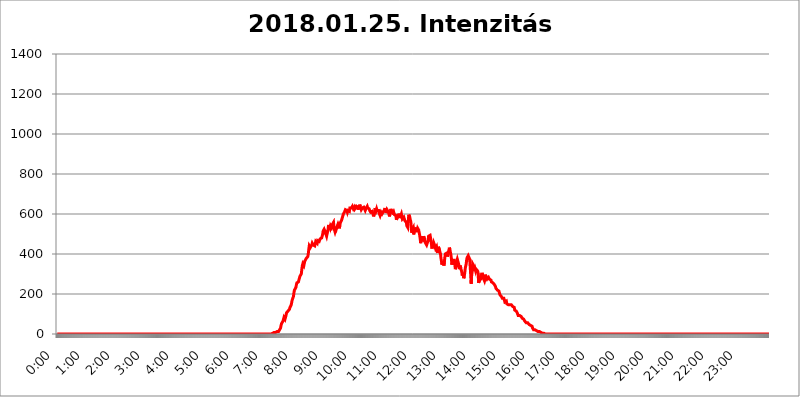
| Category | 2018.01.25. Intenzitás [W/m^2] |
|---|---|
| 0.0 | 0 |
| 0.0006944444444444445 | 0 |
| 0.001388888888888889 | 0 |
| 0.0020833333333333333 | 0 |
| 0.002777777777777778 | 0 |
| 0.003472222222222222 | 0 |
| 0.004166666666666667 | 0 |
| 0.004861111111111111 | 0 |
| 0.005555555555555556 | 0 |
| 0.0062499999999999995 | 0 |
| 0.006944444444444444 | 0 |
| 0.007638888888888889 | 0 |
| 0.008333333333333333 | 0 |
| 0.009027777777777779 | 0 |
| 0.009722222222222222 | 0 |
| 0.010416666666666666 | 0 |
| 0.011111111111111112 | 0 |
| 0.011805555555555555 | 0 |
| 0.012499999999999999 | 0 |
| 0.013194444444444444 | 0 |
| 0.013888888888888888 | 0 |
| 0.014583333333333332 | 0 |
| 0.015277777777777777 | 0 |
| 0.015972222222222224 | 0 |
| 0.016666666666666666 | 0 |
| 0.017361111111111112 | 0 |
| 0.018055555555555557 | 0 |
| 0.01875 | 0 |
| 0.019444444444444445 | 0 |
| 0.02013888888888889 | 0 |
| 0.020833333333333332 | 0 |
| 0.02152777777777778 | 0 |
| 0.022222222222222223 | 0 |
| 0.02291666666666667 | 0 |
| 0.02361111111111111 | 0 |
| 0.024305555555555556 | 0 |
| 0.024999999999999998 | 0 |
| 0.025694444444444447 | 0 |
| 0.02638888888888889 | 0 |
| 0.027083333333333334 | 0 |
| 0.027777777777777776 | 0 |
| 0.02847222222222222 | 0 |
| 0.029166666666666664 | 0 |
| 0.029861111111111113 | 0 |
| 0.030555555555555555 | 0 |
| 0.03125 | 0 |
| 0.03194444444444445 | 0 |
| 0.03263888888888889 | 0 |
| 0.03333333333333333 | 0 |
| 0.034027777777777775 | 0 |
| 0.034722222222222224 | 0 |
| 0.035416666666666666 | 0 |
| 0.036111111111111115 | 0 |
| 0.03680555555555556 | 0 |
| 0.0375 | 0 |
| 0.03819444444444444 | 0 |
| 0.03888888888888889 | 0 |
| 0.03958333333333333 | 0 |
| 0.04027777777777778 | 0 |
| 0.04097222222222222 | 0 |
| 0.041666666666666664 | 0 |
| 0.042361111111111106 | 0 |
| 0.04305555555555556 | 0 |
| 0.043750000000000004 | 0 |
| 0.044444444444444446 | 0 |
| 0.04513888888888889 | 0 |
| 0.04583333333333334 | 0 |
| 0.04652777777777778 | 0 |
| 0.04722222222222222 | 0 |
| 0.04791666666666666 | 0 |
| 0.04861111111111111 | 0 |
| 0.049305555555555554 | 0 |
| 0.049999999999999996 | 0 |
| 0.05069444444444445 | 0 |
| 0.051388888888888894 | 0 |
| 0.052083333333333336 | 0 |
| 0.05277777777777778 | 0 |
| 0.05347222222222222 | 0 |
| 0.05416666666666667 | 0 |
| 0.05486111111111111 | 0 |
| 0.05555555555555555 | 0 |
| 0.05625 | 0 |
| 0.05694444444444444 | 0 |
| 0.057638888888888885 | 0 |
| 0.05833333333333333 | 0 |
| 0.05902777777777778 | 0 |
| 0.059722222222222225 | 0 |
| 0.06041666666666667 | 0 |
| 0.061111111111111116 | 0 |
| 0.06180555555555556 | 0 |
| 0.0625 | 0 |
| 0.06319444444444444 | 0 |
| 0.06388888888888888 | 0 |
| 0.06458333333333334 | 0 |
| 0.06527777777777778 | 0 |
| 0.06597222222222222 | 0 |
| 0.06666666666666667 | 0 |
| 0.06736111111111111 | 0 |
| 0.06805555555555555 | 0 |
| 0.06874999999999999 | 0 |
| 0.06944444444444443 | 0 |
| 0.07013888888888889 | 0 |
| 0.07083333333333333 | 0 |
| 0.07152777777777779 | 0 |
| 0.07222222222222223 | 0 |
| 0.07291666666666667 | 0 |
| 0.07361111111111111 | 0 |
| 0.07430555555555556 | 0 |
| 0.075 | 0 |
| 0.07569444444444444 | 0 |
| 0.0763888888888889 | 0 |
| 0.07708333333333334 | 0 |
| 0.07777777777777778 | 0 |
| 0.07847222222222222 | 0 |
| 0.07916666666666666 | 0 |
| 0.0798611111111111 | 0 |
| 0.08055555555555556 | 0 |
| 0.08125 | 0 |
| 0.08194444444444444 | 0 |
| 0.08263888888888889 | 0 |
| 0.08333333333333333 | 0 |
| 0.08402777777777777 | 0 |
| 0.08472222222222221 | 0 |
| 0.08541666666666665 | 0 |
| 0.08611111111111112 | 0 |
| 0.08680555555555557 | 0 |
| 0.08750000000000001 | 0 |
| 0.08819444444444445 | 0 |
| 0.08888888888888889 | 0 |
| 0.08958333333333333 | 0 |
| 0.09027777777777778 | 0 |
| 0.09097222222222222 | 0 |
| 0.09166666666666667 | 0 |
| 0.09236111111111112 | 0 |
| 0.09305555555555556 | 0 |
| 0.09375 | 0 |
| 0.09444444444444444 | 0 |
| 0.09513888888888888 | 0 |
| 0.09583333333333333 | 0 |
| 0.09652777777777777 | 0 |
| 0.09722222222222222 | 0 |
| 0.09791666666666667 | 0 |
| 0.09861111111111111 | 0 |
| 0.09930555555555555 | 0 |
| 0.09999999999999999 | 0 |
| 0.10069444444444443 | 0 |
| 0.1013888888888889 | 0 |
| 0.10208333333333335 | 0 |
| 0.10277777777777779 | 0 |
| 0.10347222222222223 | 0 |
| 0.10416666666666667 | 0 |
| 0.10486111111111111 | 0 |
| 0.10555555555555556 | 0 |
| 0.10625 | 0 |
| 0.10694444444444444 | 0 |
| 0.1076388888888889 | 0 |
| 0.10833333333333334 | 0 |
| 0.10902777777777778 | 0 |
| 0.10972222222222222 | 0 |
| 0.1111111111111111 | 0 |
| 0.11180555555555556 | 0 |
| 0.11180555555555556 | 0 |
| 0.1125 | 0 |
| 0.11319444444444444 | 0 |
| 0.11388888888888889 | 0 |
| 0.11458333333333333 | 0 |
| 0.11527777777777777 | 0 |
| 0.11597222222222221 | 0 |
| 0.11666666666666665 | 0 |
| 0.1173611111111111 | 0 |
| 0.11805555555555557 | 0 |
| 0.11944444444444445 | 0 |
| 0.12013888888888889 | 0 |
| 0.12083333333333333 | 0 |
| 0.12152777777777778 | 0 |
| 0.12222222222222223 | 0 |
| 0.12291666666666667 | 0 |
| 0.12291666666666667 | 0 |
| 0.12361111111111112 | 0 |
| 0.12430555555555556 | 0 |
| 0.125 | 0 |
| 0.12569444444444444 | 0 |
| 0.12638888888888888 | 0 |
| 0.12708333333333333 | 0 |
| 0.16875 | 0 |
| 0.12847222222222224 | 0 |
| 0.12916666666666668 | 0 |
| 0.12986111111111112 | 0 |
| 0.13055555555555556 | 0 |
| 0.13125 | 0 |
| 0.13194444444444445 | 0 |
| 0.1326388888888889 | 0 |
| 0.13333333333333333 | 0 |
| 0.13402777777777777 | 0 |
| 0.13402777777777777 | 0 |
| 0.13472222222222222 | 0 |
| 0.13541666666666666 | 0 |
| 0.1361111111111111 | 0 |
| 0.13749999999999998 | 0 |
| 0.13819444444444443 | 0 |
| 0.1388888888888889 | 0 |
| 0.13958333333333334 | 0 |
| 0.14027777777777778 | 0 |
| 0.14097222222222222 | 0 |
| 0.14166666666666666 | 0 |
| 0.1423611111111111 | 0 |
| 0.14305555555555557 | 0 |
| 0.14375000000000002 | 0 |
| 0.14444444444444446 | 0 |
| 0.1451388888888889 | 0 |
| 0.1451388888888889 | 0 |
| 0.14652777777777778 | 0 |
| 0.14722222222222223 | 0 |
| 0.14791666666666667 | 0 |
| 0.1486111111111111 | 0 |
| 0.14930555555555555 | 0 |
| 0.15 | 0 |
| 0.15069444444444444 | 0 |
| 0.15138888888888888 | 0 |
| 0.15208333333333332 | 0 |
| 0.15277777777777776 | 0 |
| 0.15347222222222223 | 0 |
| 0.15416666666666667 | 0 |
| 0.15486111111111112 | 0 |
| 0.15555555555555556 | 0 |
| 0.15625 | 0 |
| 0.15694444444444444 | 0 |
| 0.15763888888888888 | 0 |
| 0.15833333333333333 | 0 |
| 0.15902777777777777 | 0 |
| 0.15972222222222224 | 0 |
| 0.16041666666666668 | 0 |
| 0.16111111111111112 | 0 |
| 0.16180555555555556 | 0 |
| 0.1625 | 0 |
| 0.16319444444444445 | 0 |
| 0.1638888888888889 | 0 |
| 0.16458333333333333 | 0 |
| 0.16527777777777777 | 0 |
| 0.16597222222222222 | 0 |
| 0.16666666666666666 | 0 |
| 0.1673611111111111 | 0 |
| 0.16805555555555554 | 0 |
| 0.16874999999999998 | 0 |
| 0.16944444444444443 | 0 |
| 0.17013888888888887 | 0 |
| 0.1708333333333333 | 0 |
| 0.17152777777777775 | 0 |
| 0.17222222222222225 | 0 |
| 0.1729166666666667 | 0 |
| 0.17361111111111113 | 0 |
| 0.17430555555555557 | 0 |
| 0.17500000000000002 | 0 |
| 0.17569444444444446 | 0 |
| 0.1763888888888889 | 0 |
| 0.17708333333333334 | 0 |
| 0.17777777777777778 | 0 |
| 0.17847222222222223 | 0 |
| 0.17916666666666667 | 0 |
| 0.1798611111111111 | 0 |
| 0.18055555555555555 | 0 |
| 0.18125 | 0 |
| 0.18194444444444444 | 0 |
| 0.1826388888888889 | 0 |
| 0.18333333333333335 | 0 |
| 0.1840277777777778 | 0 |
| 0.18472222222222223 | 0 |
| 0.18541666666666667 | 0 |
| 0.18611111111111112 | 0 |
| 0.18680555555555556 | 0 |
| 0.1875 | 0 |
| 0.18819444444444444 | 0 |
| 0.18888888888888888 | 0 |
| 0.18958333333333333 | 0 |
| 0.19027777777777777 | 0 |
| 0.1909722222222222 | 0 |
| 0.19166666666666665 | 0 |
| 0.19236111111111112 | 0 |
| 0.19305555555555554 | 0 |
| 0.19375 | 0 |
| 0.19444444444444445 | 0 |
| 0.1951388888888889 | 0 |
| 0.19583333333333333 | 0 |
| 0.19652777777777777 | 0 |
| 0.19722222222222222 | 0 |
| 0.19791666666666666 | 0 |
| 0.1986111111111111 | 0 |
| 0.19930555555555554 | 0 |
| 0.19999999999999998 | 0 |
| 0.20069444444444443 | 0 |
| 0.20138888888888887 | 0 |
| 0.2020833333333333 | 0 |
| 0.2027777777777778 | 0 |
| 0.2034722222222222 | 0 |
| 0.2041666666666667 | 0 |
| 0.20486111111111113 | 0 |
| 0.20555555555555557 | 0 |
| 0.20625000000000002 | 0 |
| 0.20694444444444446 | 0 |
| 0.2076388888888889 | 0 |
| 0.20833333333333334 | 0 |
| 0.20902777777777778 | 0 |
| 0.20972222222222223 | 0 |
| 0.21041666666666667 | 0 |
| 0.2111111111111111 | 0 |
| 0.21180555555555555 | 0 |
| 0.2125 | 0 |
| 0.21319444444444444 | 0 |
| 0.2138888888888889 | 0 |
| 0.21458333333333335 | 0 |
| 0.2152777777777778 | 0 |
| 0.21597222222222223 | 0 |
| 0.21666666666666667 | 0 |
| 0.21736111111111112 | 0 |
| 0.21805555555555556 | 0 |
| 0.21875 | 0 |
| 0.21944444444444444 | 0 |
| 0.22013888888888888 | 0 |
| 0.22083333333333333 | 0 |
| 0.22152777777777777 | 0 |
| 0.2222222222222222 | 0 |
| 0.22291666666666665 | 0 |
| 0.2236111111111111 | 0 |
| 0.22430555555555556 | 0 |
| 0.225 | 0 |
| 0.22569444444444445 | 0 |
| 0.2263888888888889 | 0 |
| 0.22708333333333333 | 0 |
| 0.22777777777777777 | 0 |
| 0.22847222222222222 | 0 |
| 0.22916666666666666 | 0 |
| 0.2298611111111111 | 0 |
| 0.23055555555555554 | 0 |
| 0.23124999999999998 | 0 |
| 0.23194444444444443 | 0 |
| 0.23263888888888887 | 0 |
| 0.2333333333333333 | 0 |
| 0.2340277777777778 | 0 |
| 0.2347222222222222 | 0 |
| 0.2354166666666667 | 0 |
| 0.23611111111111113 | 0 |
| 0.23680555555555557 | 0 |
| 0.23750000000000002 | 0 |
| 0.23819444444444446 | 0 |
| 0.2388888888888889 | 0 |
| 0.23958333333333334 | 0 |
| 0.24027777777777778 | 0 |
| 0.24097222222222223 | 0 |
| 0.24166666666666667 | 0 |
| 0.2423611111111111 | 0 |
| 0.24305555555555555 | 0 |
| 0.24375 | 0 |
| 0.24444444444444446 | 0 |
| 0.24513888888888888 | 0 |
| 0.24583333333333335 | 0 |
| 0.2465277777777778 | 0 |
| 0.24722222222222223 | 0 |
| 0.24791666666666667 | 0 |
| 0.24861111111111112 | 0 |
| 0.24930555555555556 | 0 |
| 0.25 | 0 |
| 0.25069444444444444 | 0 |
| 0.2513888888888889 | 0 |
| 0.2520833333333333 | 0 |
| 0.25277777777777777 | 0 |
| 0.2534722222222222 | 0 |
| 0.25416666666666665 | 0 |
| 0.2548611111111111 | 0 |
| 0.2555555555555556 | 0 |
| 0.25625000000000003 | 0 |
| 0.2569444444444445 | 0 |
| 0.2576388888888889 | 0 |
| 0.25833333333333336 | 0 |
| 0.2590277777777778 | 0 |
| 0.25972222222222224 | 0 |
| 0.2604166666666667 | 0 |
| 0.2611111111111111 | 0 |
| 0.26180555555555557 | 0 |
| 0.2625 | 0 |
| 0.26319444444444445 | 0 |
| 0.2638888888888889 | 0 |
| 0.26458333333333334 | 0 |
| 0.2652777777777778 | 0 |
| 0.2659722222222222 | 0 |
| 0.26666666666666666 | 0 |
| 0.2673611111111111 | 0 |
| 0.26805555555555555 | 0 |
| 0.26875 | 0 |
| 0.26944444444444443 | 0 |
| 0.2701388888888889 | 0 |
| 0.2708333333333333 | 0 |
| 0.27152777777777776 | 0 |
| 0.2722222222222222 | 0 |
| 0.27291666666666664 | 0 |
| 0.2736111111111111 | 0 |
| 0.2743055555555555 | 0 |
| 0.27499999999999997 | 0 |
| 0.27569444444444446 | 0 |
| 0.27638888888888885 | 0 |
| 0.27708333333333335 | 0 |
| 0.2777777777777778 | 0 |
| 0.27847222222222223 | 0 |
| 0.2791666666666667 | 0 |
| 0.2798611111111111 | 0 |
| 0.28055555555555556 | 0 |
| 0.28125 | 0 |
| 0.28194444444444444 | 0 |
| 0.2826388888888889 | 0 |
| 0.2833333333333333 | 0 |
| 0.28402777777777777 | 0 |
| 0.2847222222222222 | 0 |
| 0.28541666666666665 | 0 |
| 0.28611111111111115 | 0 |
| 0.28680555555555554 | 0 |
| 0.28750000000000003 | 0 |
| 0.2881944444444445 | 0 |
| 0.2888888888888889 | 0 |
| 0.28958333333333336 | 0 |
| 0.2902777777777778 | 0 |
| 0.29097222222222224 | 0 |
| 0.2916666666666667 | 0 |
| 0.2923611111111111 | 0 |
| 0.29305555555555557 | 0 |
| 0.29375 | 0 |
| 0.29444444444444445 | 0 |
| 0.2951388888888889 | 0 |
| 0.29583333333333334 | 0 |
| 0.2965277777777778 | 0 |
| 0.2972222222222222 | 0 |
| 0.29791666666666666 | 0 |
| 0.2986111111111111 | 0 |
| 0.29930555555555555 | 3.525 |
| 0.3 | 0 |
| 0.30069444444444443 | 3.525 |
| 0.3013888888888889 | 3.525 |
| 0.3020833333333333 | 3.525 |
| 0.30277777777777776 | 3.525 |
| 0.3034722222222222 | 3.525 |
| 0.30416666666666664 | 7.887 |
| 0.3048611111111111 | 7.887 |
| 0.3055555555555555 | 7.887 |
| 0.30624999999999997 | 7.887 |
| 0.3069444444444444 | 7.887 |
| 0.3076388888888889 | 7.887 |
| 0.30833333333333335 | 12.257 |
| 0.3090277777777778 | 12.257 |
| 0.30972222222222223 | 12.257 |
| 0.3104166666666667 | 12.257 |
| 0.3111111111111111 | 16.636 |
| 0.31180555555555556 | 21.024 |
| 0.3125 | 25.419 |
| 0.31319444444444444 | 29.823 |
| 0.3138888888888889 | 43.079 |
| 0.3145833333333333 | 51.951 |
| 0.31527777777777777 | 56.398 |
| 0.3159722222222222 | 56.398 |
| 0.31666666666666665 | 65.31 |
| 0.31736111111111115 | 74.246 |
| 0.31805555555555554 | 83.205 |
| 0.31875000000000003 | 83.205 |
| 0.3194444444444445 | 74.246 |
| 0.3201388888888889 | 74.246 |
| 0.32083333333333336 | 92.184 |
| 0.3215277777777778 | 105.69 |
| 0.32222222222222224 | 105.69 |
| 0.3229166666666667 | 105.69 |
| 0.3236111111111111 | 114.716 |
| 0.32430555555555557 | 119.235 |
| 0.325 | 119.235 |
| 0.32569444444444445 | 123.758 |
| 0.3263888888888889 | 132.814 |
| 0.32708333333333334 | 137.347 |
| 0.3277777777777778 | 141.884 |
| 0.3284722222222222 | 150.964 |
| 0.32916666666666666 | 164.605 |
| 0.3298611111111111 | 173.709 |
| 0.33055555555555555 | 178.264 |
| 0.33125 | 187.378 |
| 0.33194444444444443 | 205.62 |
| 0.3326388888888889 | 219.309 |
| 0.3333333333333333 | 219.309 |
| 0.3340277777777778 | 219.309 |
| 0.3347222222222222 | 233 |
| 0.3354166666666667 | 246.689 |
| 0.3361111111111111 | 255.813 |
| 0.3368055555555556 | 255.813 |
| 0.33749999999999997 | 251.251 |
| 0.33819444444444446 | 260.373 |
| 0.33888888888888885 | 269.49 |
| 0.33958333333333335 | 278.603 |
| 0.34027777777777773 | 287.709 |
| 0.34097222222222223 | 283.156 |
| 0.3416666666666666 | 287.709 |
| 0.3423611111111111 | 301.354 |
| 0.3430555555555555 | 324.052 |
| 0.34375 | 342.162 |
| 0.3444444444444445 | 351.198 |
| 0.3451388888888889 | 351.198 |
| 0.3458333333333334 | 342.162 |
| 0.34652777777777777 | 346.682 |
| 0.34722222222222227 | 364.728 |
| 0.34791666666666665 | 364.728 |
| 0.34861111111111115 | 364.728 |
| 0.34930555555555554 | 378.224 |
| 0.35000000000000003 | 378.224 |
| 0.3506944444444444 | 378.224 |
| 0.3513888888888889 | 387.202 |
| 0.3520833333333333 | 400.638 |
| 0.3527777777777778 | 422.943 |
| 0.3534722222222222 | 440.702 |
| 0.3541666666666667 | 436.27 |
| 0.3548611111111111 | 431.833 |
| 0.35555555555555557 | 431.833 |
| 0.35625 | 427.39 |
| 0.35694444444444445 | 445.129 |
| 0.3576388888888889 | 453.968 |
| 0.35833333333333334 | 453.968 |
| 0.3590277777777778 | 445.129 |
| 0.3597222222222222 | 449.551 |
| 0.36041666666666666 | 449.551 |
| 0.3611111111111111 | 440.702 |
| 0.36180555555555555 | 440.702 |
| 0.3625 | 462.786 |
| 0.36319444444444443 | 462.786 |
| 0.3638888888888889 | 458.38 |
| 0.3645833333333333 | 453.968 |
| 0.3652777777777778 | 467.187 |
| 0.3659722222222222 | 471.582 |
| 0.3666666666666667 | 467.187 |
| 0.3673611111111111 | 462.786 |
| 0.3680555555555556 | 462.786 |
| 0.36874999999999997 | 475.972 |
| 0.36944444444444446 | 475.972 |
| 0.37013888888888885 | 471.582 |
| 0.37083333333333335 | 480.356 |
| 0.37152777777777773 | 484.735 |
| 0.37222222222222223 | 497.836 |
| 0.3729166666666666 | 515.223 |
| 0.3736111111111111 | 519.555 |
| 0.3743055555555555 | 523.88 |
| 0.375 | 519.555 |
| 0.3756944444444445 | 510.885 |
| 0.3763888888888889 | 506.542 |
| 0.3770833333333334 | 510.885 |
| 0.37777777777777777 | 489.108 |
| 0.37847222222222227 | 493.475 |
| 0.37916666666666665 | 489.108 |
| 0.37986111111111115 | 523.88 |
| 0.38055555555555554 | 545.416 |
| 0.38125000000000003 | 541.121 |
| 0.3819444444444444 | 541.121 |
| 0.3826388888888889 | 528.2 |
| 0.3833333333333333 | 541.121 |
| 0.3840277777777778 | 536.82 |
| 0.3847222222222222 | 532.513 |
| 0.3854166666666667 | 528.2 |
| 0.3861111111111111 | 549.704 |
| 0.38680555555555557 | 549.704 |
| 0.3875 | 558.261 |
| 0.38819444444444445 | 532.513 |
| 0.3888888888888889 | 519.555 |
| 0.38958333333333334 | 510.885 |
| 0.3902777777777778 | 519.555 |
| 0.3909722222222222 | 536.82 |
| 0.39166666666666666 | 528.2 |
| 0.3923611111111111 | 536.82 |
| 0.39305555555555555 | 541.121 |
| 0.39375 | 549.704 |
| 0.39444444444444443 | 545.416 |
| 0.3951388888888889 | 536.82 |
| 0.3958333333333333 | 528.2 |
| 0.3965277777777778 | 553.986 |
| 0.3972222222222222 | 553.986 |
| 0.3979166666666667 | 549.704 |
| 0.3986111111111111 | 566.793 |
| 0.3993055555555556 | 571.049 |
| 0.39999999999999997 | 583.779 |
| 0.40069444444444446 | 592.233 |
| 0.40138888888888885 | 600.661 |
| 0.40208333333333335 | 604.864 |
| 0.40277777777777773 | 609.062 |
| 0.40347222222222223 | 604.864 |
| 0.4041666666666666 | 621.613 |
| 0.4048611111111111 | 625.784 |
| 0.4055555555555555 | 621.613 |
| 0.40625 | 617.436 |
| 0.4069444444444445 | 609.062 |
| 0.4076388888888889 | 617.436 |
| 0.4083333333333334 | 621.613 |
| 0.40902777777777777 | 613.252 |
| 0.40972222222222227 | 613.252 |
| 0.41041666666666665 | 629.948 |
| 0.41111111111111115 | 629.948 |
| 0.41180555555555554 | 625.784 |
| 0.41250000000000003 | 629.948 |
| 0.4131944444444444 | 629.948 |
| 0.4138888888888889 | 638.256 |
| 0.4145833333333333 | 638.256 |
| 0.4152777777777778 | 625.784 |
| 0.4159722222222222 | 629.948 |
| 0.4166666666666667 | 634.105 |
| 0.4173611111111111 | 625.784 |
| 0.41805555555555557 | 625.784 |
| 0.41875 | 629.948 |
| 0.41944444444444445 | 638.256 |
| 0.4201388888888889 | 638.256 |
| 0.42083333333333334 | 634.105 |
| 0.4215277777777778 | 629.948 |
| 0.4222222222222222 | 621.613 |
| 0.42291666666666666 | 642.4 |
| 0.4236111111111111 | 634.105 |
| 0.42430555555555555 | 646.537 |
| 0.425 | 638.256 |
| 0.42569444444444443 | 634.105 |
| 0.4263888888888889 | 621.613 |
| 0.4270833333333333 | 625.784 |
| 0.4277777777777778 | 629.948 |
| 0.4284722222222222 | 634.105 |
| 0.4291666666666667 | 634.105 |
| 0.4298611111111111 | 634.105 |
| 0.4305555555555556 | 638.256 |
| 0.43124999999999997 | 629.948 |
| 0.43194444444444446 | 617.436 |
| 0.43263888888888885 | 621.613 |
| 0.43333333333333335 | 629.948 |
| 0.43402777777777773 | 634.105 |
| 0.43472222222222223 | 638.256 |
| 0.4354166666666666 | 629.948 |
| 0.4361111111111111 | 629.948 |
| 0.4368055555555555 | 625.784 |
| 0.4375 | 625.784 |
| 0.4381944444444445 | 617.436 |
| 0.4388888888888889 | 613.252 |
| 0.4395833333333334 | 609.062 |
| 0.44027777777777777 | 613.252 |
| 0.44097222222222227 | 609.062 |
| 0.44166666666666665 | 613.252 |
| 0.44236111111111115 | 609.062 |
| 0.44305555555555554 | 596.45 |
| 0.44375000000000003 | 588.009 |
| 0.4444444444444444 | 583.779 |
| 0.4451388888888889 | 609.062 |
| 0.4458333333333333 | 629.948 |
| 0.4465277777777778 | 629.948 |
| 0.4472222222222222 | 617.436 |
| 0.4479166666666667 | 625.784 |
| 0.4486111111111111 | 617.436 |
| 0.44930555555555557 | 617.436 |
| 0.45 | 617.436 |
| 0.45069444444444445 | 617.436 |
| 0.4513888888888889 | 604.864 |
| 0.45208333333333334 | 609.062 |
| 0.4527777777777778 | 592.233 |
| 0.4534722222222222 | 592.233 |
| 0.45416666666666666 | 609.062 |
| 0.4548611111111111 | 604.864 |
| 0.45555555555555555 | 600.661 |
| 0.45625 | 596.45 |
| 0.45694444444444443 | 596.45 |
| 0.4576388888888889 | 613.252 |
| 0.4583333333333333 | 609.062 |
| 0.4590277777777778 | 621.613 |
| 0.4597222222222222 | 629.948 |
| 0.4604166666666667 | 617.436 |
| 0.4611111111111111 | 604.864 |
| 0.4618055555555556 | 600.661 |
| 0.46249999999999997 | 621.613 |
| 0.46319444444444446 | 621.613 |
| 0.46388888888888885 | 621.613 |
| 0.46458333333333335 | 609.062 |
| 0.46527777777777773 | 604.864 |
| 0.46597222222222223 | 588.009 |
| 0.4666666666666666 | 600.661 |
| 0.4673611111111111 | 613.252 |
| 0.4680555555555555 | 625.784 |
| 0.46875 | 609.062 |
| 0.4694444444444445 | 609.062 |
| 0.4701388888888889 | 613.252 |
| 0.4708333333333334 | 613.252 |
| 0.47152777777777777 | 596.45 |
| 0.47222222222222227 | 604.864 |
| 0.47291666666666665 | 596.45 |
| 0.47361111111111115 | 600.661 |
| 0.47430555555555554 | 600.661 |
| 0.47500000000000003 | 592.233 |
| 0.4756944444444444 | 571.049 |
| 0.4763888888888889 | 566.793 |
| 0.4770833333333333 | 575.299 |
| 0.4777777777777778 | 592.233 |
| 0.4784722222222222 | 600.661 |
| 0.4791666666666667 | 588.009 |
| 0.4798611111111111 | 600.661 |
| 0.48055555555555557 | 579.542 |
| 0.48125 | 588.009 |
| 0.48194444444444445 | 588.009 |
| 0.4826388888888889 | 600.661 |
| 0.48333333333333334 | 588.009 |
| 0.4840277777777778 | 575.299 |
| 0.4847222222222222 | 579.542 |
| 0.48541666666666666 | 579.542 |
| 0.4861111111111111 | 583.779 |
| 0.48680555555555555 | 583.779 |
| 0.4875 | 566.793 |
| 0.48819444444444443 | 566.793 |
| 0.4888888888888889 | 562.53 |
| 0.4895833333333333 | 558.261 |
| 0.4902777777777778 | 541.121 |
| 0.4909722222222222 | 541.121 |
| 0.4916666666666667 | 532.513 |
| 0.4923611111111111 | 566.793 |
| 0.4930555555555556 | 596.45 |
| 0.49374999999999997 | 592.233 |
| 0.49444444444444446 | 583.779 |
| 0.49513888888888885 | 571.049 |
| 0.49583333333333335 | 562.53 |
| 0.49652777777777773 | 536.82 |
| 0.49722222222222223 | 506.542 |
| 0.4979166666666666 | 523.88 |
| 0.4986111111111111 | 523.88 |
| 0.4993055555555555 | 532.513 |
| 0.5 | 497.836 |
| 0.5006944444444444 | 519.555 |
| 0.5013888888888889 | 532.513 |
| 0.5020833333333333 | 532.513 |
| 0.5027777777777778 | 515.223 |
| 0.5034722222222222 | 519.555 |
| 0.5041666666666667 | 515.223 |
| 0.5048611111111111 | 515.223 |
| 0.5055555555555555 | 528.2 |
| 0.50625 | 532.513 |
| 0.5069444444444444 | 519.555 |
| 0.5076388888888889 | 506.542 |
| 0.5083333333333333 | 493.475 |
| 0.5090277777777777 | 475.972 |
| 0.5097222222222222 | 453.968 |
| 0.5104166666666666 | 480.356 |
| 0.5111111111111112 | 489.108 |
| 0.5118055555555555 | 475.972 |
| 0.5125000000000001 | 462.786 |
| 0.5131944444444444 | 471.582 |
| 0.513888888888889 | 489.108 |
| 0.5145833333333333 | 484.735 |
| 0.5152777777777778 | 471.582 |
| 0.5159722222222222 | 458.38 |
| 0.5166666666666667 | 462.786 |
| 0.517361111111111 | 453.968 |
| 0.5180555555555556 | 445.129 |
| 0.5187499999999999 | 445.129 |
| 0.5194444444444445 | 449.551 |
| 0.5201388888888888 | 467.187 |
| 0.5208333333333334 | 489.108 |
| 0.5215277777777778 | 493.475 |
| 0.5222222222222223 | 493.475 |
| 0.5229166666666667 | 493.475 |
| 0.5236111111111111 | 480.356 |
| 0.5243055555555556 | 475.972 |
| 0.525 | 445.129 |
| 0.5256944444444445 | 427.39 |
| 0.5263888888888889 | 458.38 |
| 0.5270833333333333 | 449.551 |
| 0.5277777777777778 | 458.38 |
| 0.5284722222222222 | 453.968 |
| 0.5291666666666667 | 445.129 |
| 0.5298611111111111 | 436.27 |
| 0.5305555555555556 | 427.39 |
| 0.53125 | 431.833 |
| 0.5319444444444444 | 436.27 |
| 0.5326388888888889 | 418.492 |
| 0.5333333333333333 | 405.108 |
| 0.5340277777777778 | 422.943 |
| 0.5347222222222222 | 436.27 |
| 0.5354166666666667 | 436.27 |
| 0.5361111111111111 | 418.492 |
| 0.5368055555555555 | 414.035 |
| 0.5375 | 400.638 |
| 0.5381944444444444 | 378.224 |
| 0.5388888888888889 | 364.728 |
| 0.5395833333333333 | 346.682 |
| 0.5402777777777777 | 364.728 |
| 0.5409722222222222 | 364.728 |
| 0.5416666666666666 | 351.198 |
| 0.5423611111111112 | 342.162 |
| 0.5430555555555555 | 364.728 |
| 0.5437500000000001 | 387.202 |
| 0.5444444444444444 | 400.638 |
| 0.545138888888889 | 405.108 |
| 0.5458333333333333 | 405.108 |
| 0.5465277777777778 | 405.108 |
| 0.5472222222222222 | 387.202 |
| 0.5479166666666667 | 396.164 |
| 0.548611111111111 | 405.108 |
| 0.5493055555555556 | 409.574 |
| 0.5499999999999999 | 431.833 |
| 0.5506944444444445 | 422.943 |
| 0.5513888888888888 | 409.574 |
| 0.5520833333333334 | 396.164 |
| 0.5527777777777778 | 378.224 |
| 0.5534722222222223 | 346.682 |
| 0.5541666666666667 | 342.162 |
| 0.5548611111111111 | 369.23 |
| 0.5555555555555556 | 369.23 |
| 0.55625 | 369.23 |
| 0.5569444444444445 | 369.23 |
| 0.5576388888888889 | 346.682 |
| 0.5583333333333333 | 324.052 |
| 0.5590277777777778 | 333.113 |
| 0.5597222222222222 | 355.712 |
| 0.5604166666666667 | 360.221 |
| 0.5611111111111111 | 373.729 |
| 0.5618055555555556 | 364.728 |
| 0.5625 | 364.728 |
| 0.5631944444444444 | 346.682 |
| 0.5638888888888889 | 324.052 |
| 0.5645833333333333 | 319.517 |
| 0.5652777777777778 | 342.162 |
| 0.5659722222222222 | 328.584 |
| 0.5666666666666667 | 324.052 |
| 0.5673611111111111 | 310.44 |
| 0.5680555555555555 | 292.259 |
| 0.56875 | 305.898 |
| 0.5694444444444444 | 296.808 |
| 0.5701388888888889 | 278.603 |
| 0.5708333333333333 | 287.709 |
| 0.5715277777777777 | 305.898 |
| 0.5722222222222222 | 328.584 |
| 0.5729166666666666 | 328.584 |
| 0.5736111111111112 | 351.198 |
| 0.5743055555555555 | 373.729 |
| 0.5750000000000001 | 382.715 |
| 0.5756944444444444 | 382.715 |
| 0.576388888888889 | 391.685 |
| 0.5770833333333333 | 396.164 |
| 0.5777777777777778 | 387.202 |
| 0.5784722222222222 | 373.729 |
| 0.5791666666666667 | 373.729 |
| 0.579861111111111 | 296.808 |
| 0.5805555555555556 | 251.251 |
| 0.5812499999999999 | 296.808 |
| 0.5819444444444445 | 310.44 |
| 0.5826388888888888 | 351.198 |
| 0.5833333333333334 | 351.198 |
| 0.5840277777777778 | 346.682 |
| 0.5847222222222223 | 337.639 |
| 0.5854166666666667 | 314.98 |
| 0.5861111111111111 | 324.052 |
| 0.5868055555555556 | 314.98 |
| 0.5875 | 324.052 |
| 0.5881944444444445 | 324.052 |
| 0.5888888888888889 | 319.517 |
| 0.5895833333333333 | 314.98 |
| 0.5902777777777778 | 305.898 |
| 0.5909722222222222 | 255.813 |
| 0.5916666666666667 | 255.813 |
| 0.5923611111111111 | 269.49 |
| 0.5930555555555556 | 278.603 |
| 0.59375 | 269.49 |
| 0.5944444444444444 | 264.932 |
| 0.5951388888888889 | 296.808 |
| 0.5958333333333333 | 305.898 |
| 0.5965277777777778 | 301.354 |
| 0.5972222222222222 | 283.156 |
| 0.5979166666666667 | 287.709 |
| 0.5986111111111111 | 283.156 |
| 0.5993055555555555 | 264.932 |
| 0.6 | 274.047 |
| 0.6006944444444444 | 296.808 |
| 0.6013888888888889 | 283.156 |
| 0.6020833333333333 | 283.156 |
| 0.6027777777777777 | 274.047 |
| 0.6034722222222222 | 278.603 |
| 0.6041666666666666 | 278.603 |
| 0.6048611111111112 | 283.156 |
| 0.6055555555555555 | 278.603 |
| 0.6062500000000001 | 274.047 |
| 0.6069444444444444 | 274.047 |
| 0.607638888888889 | 269.49 |
| 0.6083333333333333 | 269.49 |
| 0.6090277777777778 | 260.373 |
| 0.6097222222222222 | 260.373 |
| 0.6104166666666667 | 260.373 |
| 0.611111111111111 | 255.813 |
| 0.6118055555555556 | 255.813 |
| 0.6124999999999999 | 251.251 |
| 0.6131944444444445 | 246.689 |
| 0.6138888888888888 | 242.127 |
| 0.6145833333333334 | 237.564 |
| 0.6152777777777778 | 228.436 |
| 0.6159722222222223 | 228.436 |
| 0.6166666666666667 | 228.436 |
| 0.6173611111111111 | 219.309 |
| 0.6180555555555556 | 219.309 |
| 0.61875 | 219.309 |
| 0.6194444444444445 | 214.746 |
| 0.6201388888888889 | 210.182 |
| 0.6208333333333333 | 196.497 |
| 0.6215277777777778 | 196.497 |
| 0.6222222222222222 | 191.937 |
| 0.6229166666666667 | 187.378 |
| 0.6236111111111111 | 191.937 |
| 0.6243055555555556 | 178.264 |
| 0.625 | 182.82 |
| 0.6256944444444444 | 182.82 |
| 0.6263888888888889 | 178.264 |
| 0.6270833333333333 | 169.156 |
| 0.6277777777777778 | 160.056 |
| 0.6284722222222222 | 155.509 |
| 0.6291666666666667 | 160.056 |
| 0.6298611111111111 | 164.605 |
| 0.6305555555555555 | 150.964 |
| 0.63125 | 155.509 |
| 0.6319444444444444 | 150.964 |
| 0.6326388888888889 | 146.423 |
| 0.6333333333333333 | 146.423 |
| 0.6340277777777777 | 146.423 |
| 0.6347222222222222 | 146.423 |
| 0.6354166666666666 | 146.423 |
| 0.6361111111111112 | 146.423 |
| 0.6368055555555555 | 146.423 |
| 0.6375000000000001 | 141.884 |
| 0.6381944444444444 | 141.884 |
| 0.638888888888889 | 137.347 |
| 0.6395833333333333 | 132.814 |
| 0.6402777777777778 | 132.814 |
| 0.6409722222222222 | 132.814 |
| 0.6416666666666667 | 119.235 |
| 0.642361111111111 | 114.716 |
| 0.6430555555555556 | 119.235 |
| 0.6437499999999999 | 114.716 |
| 0.6444444444444445 | 110.201 |
| 0.6451388888888888 | 105.69 |
| 0.6458333333333334 | 101.184 |
| 0.6465277777777778 | 92.184 |
| 0.6472222222222223 | 92.184 |
| 0.6479166666666667 | 92.184 |
| 0.6486111111111111 | 92.184 |
| 0.6493055555555556 | 87.692 |
| 0.65 | 87.692 |
| 0.6506944444444445 | 87.692 |
| 0.6513888888888889 | 83.205 |
| 0.6520833333333333 | 78.722 |
| 0.6527777777777778 | 78.722 |
| 0.6534722222222222 | 78.722 |
| 0.6541666666666667 | 74.246 |
| 0.6548611111111111 | 69.775 |
| 0.6555555555555556 | 65.31 |
| 0.65625 | 65.31 |
| 0.6569444444444444 | 60.85 |
| 0.6576388888888889 | 56.398 |
| 0.6583333333333333 | 51.951 |
| 0.6590277777777778 | 56.398 |
| 0.6597222222222222 | 56.398 |
| 0.6604166666666667 | 51.951 |
| 0.6611111111111111 | 51.951 |
| 0.6618055555555555 | 47.511 |
| 0.6625 | 47.511 |
| 0.6631944444444444 | 43.079 |
| 0.6638888888888889 | 43.079 |
| 0.6645833333333333 | 43.079 |
| 0.6652777777777777 | 38.653 |
| 0.6659722222222222 | 38.653 |
| 0.6666666666666666 | 29.823 |
| 0.6673611111111111 | 25.419 |
| 0.6680555555555556 | 21.024 |
| 0.6687500000000001 | 21.024 |
| 0.6694444444444444 | 21.024 |
| 0.6701388888888888 | 21.024 |
| 0.6708333333333334 | 16.636 |
| 0.6715277777777778 | 16.636 |
| 0.6722222222222222 | 16.636 |
| 0.6729166666666666 | 12.257 |
| 0.6736111111111112 | 12.257 |
| 0.6743055555555556 | 12.257 |
| 0.6749999999999999 | 12.257 |
| 0.6756944444444444 | 12.257 |
| 0.6763888888888889 | 12.257 |
| 0.6770833333333334 | 7.887 |
| 0.6777777777777777 | 7.887 |
| 0.6784722222222223 | 7.887 |
| 0.6791666666666667 | 3.525 |
| 0.6798611111111111 | 3.525 |
| 0.6805555555555555 | 3.525 |
| 0.68125 | 3.525 |
| 0.6819444444444445 | 3.525 |
| 0.6826388888888889 | 3.525 |
| 0.6833333333333332 | 3.525 |
| 0.6840277777777778 | 3.525 |
| 0.6847222222222222 | 0 |
| 0.6854166666666667 | 0 |
| 0.686111111111111 | 0 |
| 0.6868055555555556 | 0 |
| 0.6875 | 0 |
| 0.6881944444444444 | 0 |
| 0.688888888888889 | 0 |
| 0.6895833333333333 | 0 |
| 0.6902777777777778 | 0 |
| 0.6909722222222222 | 0 |
| 0.6916666666666668 | 0 |
| 0.6923611111111111 | 0 |
| 0.6930555555555555 | 0 |
| 0.69375 | 0 |
| 0.6944444444444445 | 0 |
| 0.6951388888888889 | 0 |
| 0.6958333333333333 | 0 |
| 0.6965277777777777 | 0 |
| 0.6972222222222223 | 0 |
| 0.6979166666666666 | 0 |
| 0.6986111111111111 | 0 |
| 0.6993055555555556 | 0 |
| 0.7000000000000001 | 0 |
| 0.7006944444444444 | 0 |
| 0.7013888888888888 | 0 |
| 0.7020833333333334 | 0 |
| 0.7027777777777778 | 0 |
| 0.7034722222222222 | 0 |
| 0.7041666666666666 | 0 |
| 0.7048611111111112 | 0 |
| 0.7055555555555556 | 0 |
| 0.7062499999999999 | 0 |
| 0.7069444444444444 | 0 |
| 0.7076388888888889 | 0 |
| 0.7083333333333334 | 0 |
| 0.7090277777777777 | 0 |
| 0.7097222222222223 | 0 |
| 0.7104166666666667 | 0 |
| 0.7111111111111111 | 0 |
| 0.7118055555555555 | 0 |
| 0.7125 | 0 |
| 0.7131944444444445 | 0 |
| 0.7138888888888889 | 0 |
| 0.7145833333333332 | 0 |
| 0.7152777777777778 | 0 |
| 0.7159722222222222 | 0 |
| 0.7166666666666667 | 0 |
| 0.717361111111111 | 0 |
| 0.7180555555555556 | 0 |
| 0.71875 | 0 |
| 0.7194444444444444 | 0 |
| 0.720138888888889 | 0 |
| 0.7208333333333333 | 0 |
| 0.7215277777777778 | 0 |
| 0.7222222222222222 | 0 |
| 0.7229166666666668 | 0 |
| 0.7236111111111111 | 0 |
| 0.7243055555555555 | 0 |
| 0.725 | 0 |
| 0.7256944444444445 | 0 |
| 0.7263888888888889 | 0 |
| 0.7270833333333333 | 0 |
| 0.7277777777777777 | 0 |
| 0.7284722222222223 | 0 |
| 0.7291666666666666 | 0 |
| 0.7298611111111111 | 0 |
| 0.7305555555555556 | 0 |
| 0.7312500000000001 | 0 |
| 0.7319444444444444 | 0 |
| 0.7326388888888888 | 0 |
| 0.7333333333333334 | 0 |
| 0.7340277777777778 | 0 |
| 0.7347222222222222 | 0 |
| 0.7354166666666666 | 0 |
| 0.7361111111111112 | 0 |
| 0.7368055555555556 | 0 |
| 0.7374999999999999 | 0 |
| 0.7381944444444444 | 0 |
| 0.7388888888888889 | 0 |
| 0.7395833333333334 | 0 |
| 0.7402777777777777 | 0 |
| 0.7409722222222223 | 0 |
| 0.7416666666666667 | 0 |
| 0.7423611111111111 | 0 |
| 0.7430555555555555 | 0 |
| 0.74375 | 0 |
| 0.7444444444444445 | 0 |
| 0.7451388888888889 | 0 |
| 0.7458333333333332 | 0 |
| 0.7465277777777778 | 0 |
| 0.7472222222222222 | 0 |
| 0.7479166666666667 | 0 |
| 0.748611111111111 | 0 |
| 0.7493055555555556 | 0 |
| 0.75 | 0 |
| 0.7506944444444444 | 0 |
| 0.751388888888889 | 0 |
| 0.7520833333333333 | 0 |
| 0.7527777777777778 | 0 |
| 0.7534722222222222 | 0 |
| 0.7541666666666668 | 0 |
| 0.7548611111111111 | 0 |
| 0.7555555555555555 | 0 |
| 0.75625 | 0 |
| 0.7569444444444445 | 0 |
| 0.7576388888888889 | 0 |
| 0.7583333333333333 | 0 |
| 0.7590277777777777 | 0 |
| 0.7597222222222223 | 0 |
| 0.7604166666666666 | 0 |
| 0.7611111111111111 | 0 |
| 0.7618055555555556 | 0 |
| 0.7625000000000001 | 0 |
| 0.7631944444444444 | 0 |
| 0.7638888888888888 | 0 |
| 0.7645833333333334 | 0 |
| 0.7652777777777778 | 0 |
| 0.7659722222222222 | 0 |
| 0.7666666666666666 | 0 |
| 0.7673611111111112 | 0 |
| 0.7680555555555556 | 0 |
| 0.7687499999999999 | 0 |
| 0.7694444444444444 | 0 |
| 0.7701388888888889 | 0 |
| 0.7708333333333334 | 0 |
| 0.7715277777777777 | 0 |
| 0.7722222222222223 | 0 |
| 0.7729166666666667 | 0 |
| 0.7736111111111111 | 0 |
| 0.7743055555555555 | 0 |
| 0.775 | 0 |
| 0.7756944444444445 | 0 |
| 0.7763888888888889 | 0 |
| 0.7770833333333332 | 0 |
| 0.7777777777777778 | 0 |
| 0.7784722222222222 | 0 |
| 0.7791666666666667 | 0 |
| 0.779861111111111 | 0 |
| 0.7805555555555556 | 0 |
| 0.78125 | 0 |
| 0.7819444444444444 | 0 |
| 0.782638888888889 | 0 |
| 0.7833333333333333 | 0 |
| 0.7840277777777778 | 0 |
| 0.7847222222222222 | 0 |
| 0.7854166666666668 | 0 |
| 0.7861111111111111 | 0 |
| 0.7868055555555555 | 0 |
| 0.7875 | 0 |
| 0.7881944444444445 | 0 |
| 0.7888888888888889 | 0 |
| 0.7895833333333333 | 0 |
| 0.7902777777777777 | 0 |
| 0.7909722222222223 | 0 |
| 0.7916666666666666 | 0 |
| 0.7923611111111111 | 0 |
| 0.7930555555555556 | 0 |
| 0.7937500000000001 | 0 |
| 0.7944444444444444 | 0 |
| 0.7951388888888888 | 0 |
| 0.7958333333333334 | 0 |
| 0.7965277777777778 | 0 |
| 0.7972222222222222 | 0 |
| 0.7979166666666666 | 0 |
| 0.7986111111111112 | 0 |
| 0.7993055555555556 | 0 |
| 0.7999999999999999 | 0 |
| 0.8006944444444444 | 0 |
| 0.8013888888888889 | 0 |
| 0.8020833333333334 | 0 |
| 0.8027777777777777 | 0 |
| 0.8034722222222223 | 0 |
| 0.8041666666666667 | 0 |
| 0.8048611111111111 | 0 |
| 0.8055555555555555 | 0 |
| 0.80625 | 0 |
| 0.8069444444444445 | 0 |
| 0.8076388888888889 | 0 |
| 0.8083333333333332 | 0 |
| 0.8090277777777778 | 0 |
| 0.8097222222222222 | 0 |
| 0.8104166666666667 | 0 |
| 0.811111111111111 | 0 |
| 0.8118055555555556 | 0 |
| 0.8125 | 0 |
| 0.8131944444444444 | 0 |
| 0.813888888888889 | 0 |
| 0.8145833333333333 | 0 |
| 0.8152777777777778 | 0 |
| 0.8159722222222222 | 0 |
| 0.8166666666666668 | 0 |
| 0.8173611111111111 | 0 |
| 0.8180555555555555 | 0 |
| 0.81875 | 0 |
| 0.8194444444444445 | 0 |
| 0.8201388888888889 | 0 |
| 0.8208333333333333 | 0 |
| 0.8215277777777777 | 0 |
| 0.8222222222222223 | 0 |
| 0.8229166666666666 | 0 |
| 0.8236111111111111 | 0 |
| 0.8243055555555556 | 0 |
| 0.8250000000000001 | 0 |
| 0.8256944444444444 | 0 |
| 0.8263888888888888 | 0 |
| 0.8270833333333334 | 0 |
| 0.8277777777777778 | 0 |
| 0.8284722222222222 | 0 |
| 0.8291666666666666 | 0 |
| 0.8298611111111112 | 0 |
| 0.8305555555555556 | 0 |
| 0.8312499999999999 | 0 |
| 0.8319444444444444 | 0 |
| 0.8326388888888889 | 0 |
| 0.8333333333333334 | 0 |
| 0.8340277777777777 | 0 |
| 0.8347222222222223 | 0 |
| 0.8354166666666667 | 0 |
| 0.8361111111111111 | 0 |
| 0.8368055555555555 | 0 |
| 0.8375 | 0 |
| 0.8381944444444445 | 0 |
| 0.8388888888888889 | 0 |
| 0.8395833333333332 | 0 |
| 0.8402777777777778 | 0 |
| 0.8409722222222222 | 0 |
| 0.8416666666666667 | 0 |
| 0.842361111111111 | 0 |
| 0.8430555555555556 | 0 |
| 0.84375 | 0 |
| 0.8444444444444444 | 0 |
| 0.845138888888889 | 0 |
| 0.8458333333333333 | 0 |
| 0.8465277777777778 | 0 |
| 0.8472222222222222 | 0 |
| 0.8479166666666668 | 0 |
| 0.8486111111111111 | 0 |
| 0.8493055555555555 | 0 |
| 0.85 | 0 |
| 0.8506944444444445 | 0 |
| 0.8513888888888889 | 0 |
| 0.8520833333333333 | 0 |
| 0.8527777777777777 | 0 |
| 0.8534722222222223 | 0 |
| 0.8541666666666666 | 0 |
| 0.8548611111111111 | 0 |
| 0.8555555555555556 | 0 |
| 0.8562500000000001 | 0 |
| 0.8569444444444444 | 0 |
| 0.8576388888888888 | 0 |
| 0.8583333333333334 | 0 |
| 0.8590277777777778 | 0 |
| 0.8597222222222222 | 0 |
| 0.8604166666666666 | 0 |
| 0.8611111111111112 | 0 |
| 0.8618055555555556 | 0 |
| 0.8624999999999999 | 0 |
| 0.8631944444444444 | 0 |
| 0.8638888888888889 | 0 |
| 0.8645833333333334 | 0 |
| 0.8652777777777777 | 0 |
| 0.8659722222222223 | 0 |
| 0.8666666666666667 | 0 |
| 0.8673611111111111 | 0 |
| 0.8680555555555555 | 0 |
| 0.86875 | 0 |
| 0.8694444444444445 | 0 |
| 0.8701388888888889 | 0 |
| 0.8708333333333332 | 0 |
| 0.8715277777777778 | 0 |
| 0.8722222222222222 | 0 |
| 0.8729166666666667 | 0 |
| 0.873611111111111 | 0 |
| 0.8743055555555556 | 0 |
| 0.875 | 0 |
| 0.8756944444444444 | 0 |
| 0.876388888888889 | 0 |
| 0.8770833333333333 | 0 |
| 0.8777777777777778 | 0 |
| 0.8784722222222222 | 0 |
| 0.8791666666666668 | 0 |
| 0.8798611111111111 | 0 |
| 0.8805555555555555 | 0 |
| 0.88125 | 0 |
| 0.8819444444444445 | 0 |
| 0.8826388888888889 | 0 |
| 0.8833333333333333 | 0 |
| 0.8840277777777777 | 0 |
| 0.8847222222222223 | 0 |
| 0.8854166666666666 | 0 |
| 0.8861111111111111 | 0 |
| 0.8868055555555556 | 0 |
| 0.8875000000000001 | 0 |
| 0.8881944444444444 | 0 |
| 0.8888888888888888 | 0 |
| 0.8895833333333334 | 0 |
| 0.8902777777777778 | 0 |
| 0.8909722222222222 | 0 |
| 0.8916666666666666 | 0 |
| 0.8923611111111112 | 0 |
| 0.8930555555555556 | 0 |
| 0.8937499999999999 | 0 |
| 0.8944444444444444 | 0 |
| 0.8951388888888889 | 0 |
| 0.8958333333333334 | 0 |
| 0.8965277777777777 | 0 |
| 0.8972222222222223 | 0 |
| 0.8979166666666667 | 0 |
| 0.8986111111111111 | 0 |
| 0.8993055555555555 | 0 |
| 0.9 | 0 |
| 0.9006944444444445 | 0 |
| 0.9013888888888889 | 0 |
| 0.9020833333333332 | 0 |
| 0.9027777777777778 | 0 |
| 0.9034722222222222 | 0 |
| 0.9041666666666667 | 0 |
| 0.904861111111111 | 0 |
| 0.9055555555555556 | 0 |
| 0.90625 | 0 |
| 0.9069444444444444 | 0 |
| 0.907638888888889 | 0 |
| 0.9083333333333333 | 0 |
| 0.9090277777777778 | 0 |
| 0.9097222222222222 | 0 |
| 0.9104166666666668 | 0 |
| 0.9111111111111111 | 0 |
| 0.9118055555555555 | 0 |
| 0.9125 | 0 |
| 0.9131944444444445 | 0 |
| 0.9138888888888889 | 0 |
| 0.9145833333333333 | 0 |
| 0.9152777777777777 | 0 |
| 0.9159722222222223 | 0 |
| 0.9166666666666666 | 0 |
| 0.9173611111111111 | 0 |
| 0.9180555555555556 | 0 |
| 0.9187500000000001 | 0 |
| 0.9194444444444444 | 0 |
| 0.9201388888888888 | 0 |
| 0.9208333333333334 | 0 |
| 0.9215277777777778 | 0 |
| 0.9222222222222222 | 0 |
| 0.9229166666666666 | 0 |
| 0.9236111111111112 | 0 |
| 0.9243055555555556 | 0 |
| 0.9249999999999999 | 0 |
| 0.9256944444444444 | 0 |
| 0.9263888888888889 | 0 |
| 0.9270833333333334 | 0 |
| 0.9277777777777777 | 0 |
| 0.9284722222222223 | 0 |
| 0.9291666666666667 | 0 |
| 0.9298611111111111 | 0 |
| 0.9305555555555555 | 0 |
| 0.93125 | 0 |
| 0.9319444444444445 | 0 |
| 0.9326388888888889 | 0 |
| 0.9333333333333332 | 0 |
| 0.9340277777777778 | 0 |
| 0.9347222222222222 | 0 |
| 0.9354166666666667 | 0 |
| 0.936111111111111 | 0 |
| 0.9368055555555556 | 0 |
| 0.9375 | 0 |
| 0.9381944444444444 | 0 |
| 0.938888888888889 | 0 |
| 0.9395833333333333 | 0 |
| 0.9402777777777778 | 0 |
| 0.9409722222222222 | 0 |
| 0.9416666666666668 | 0 |
| 0.9423611111111111 | 0 |
| 0.9430555555555555 | 0 |
| 0.94375 | 0 |
| 0.9444444444444445 | 0 |
| 0.9451388888888889 | 0 |
| 0.9458333333333333 | 0 |
| 0.9465277777777777 | 0 |
| 0.9472222222222223 | 0 |
| 0.9479166666666666 | 0 |
| 0.9486111111111111 | 0 |
| 0.9493055555555556 | 0 |
| 0.9500000000000001 | 0 |
| 0.9506944444444444 | 0 |
| 0.9513888888888888 | 0 |
| 0.9520833333333334 | 0 |
| 0.9527777777777778 | 0 |
| 0.9534722222222222 | 0 |
| 0.9541666666666666 | 0 |
| 0.9548611111111112 | 0 |
| 0.9555555555555556 | 0 |
| 0.9562499999999999 | 0 |
| 0.9569444444444444 | 0 |
| 0.9576388888888889 | 0 |
| 0.9583333333333334 | 0 |
| 0.9590277777777777 | 0 |
| 0.9597222222222223 | 0 |
| 0.9604166666666667 | 0 |
| 0.9611111111111111 | 0 |
| 0.9618055555555555 | 0 |
| 0.9625 | 0 |
| 0.9631944444444445 | 0 |
| 0.9638888888888889 | 0 |
| 0.9645833333333332 | 0 |
| 0.9652777777777778 | 0 |
| 0.9659722222222222 | 0 |
| 0.9666666666666667 | 0 |
| 0.967361111111111 | 0 |
| 0.9680555555555556 | 0 |
| 0.96875 | 0 |
| 0.9694444444444444 | 0 |
| 0.970138888888889 | 0 |
| 0.9708333333333333 | 0 |
| 0.9715277777777778 | 0 |
| 0.9722222222222222 | 0 |
| 0.9729166666666668 | 0 |
| 0.9736111111111111 | 0 |
| 0.9743055555555555 | 0 |
| 0.975 | 0 |
| 0.9756944444444445 | 0 |
| 0.9763888888888889 | 0 |
| 0.9770833333333333 | 0 |
| 0.9777777777777777 | 0 |
| 0.9784722222222223 | 0 |
| 0.9791666666666666 | 0 |
| 0.9798611111111111 | 0 |
| 0.9805555555555556 | 0 |
| 0.9812500000000001 | 0 |
| 0.9819444444444444 | 0 |
| 0.9826388888888888 | 0 |
| 0.9833333333333334 | 0 |
| 0.9840277777777778 | 0 |
| 0.9847222222222222 | 0 |
| 0.9854166666666666 | 0 |
| 0.9861111111111112 | 0 |
| 0.9868055555555556 | 0 |
| 0.9874999999999999 | 0 |
| 0.9881944444444444 | 0 |
| 0.9888888888888889 | 0 |
| 0.9895833333333334 | 0 |
| 0.9902777777777777 | 0 |
| 0.9909722222222223 | 0 |
| 0.9916666666666667 | 0 |
| 0.9923611111111111 | 0 |
| 0.9930555555555555 | 0 |
| 0.99375 | 0 |
| 0.9944444444444445 | 0 |
| 0.9951388888888889 | 0 |
| 0.9958333333333332 | 0 |
| 0.9965277777777778 | 0 |
| 0.9972222222222222 | 0 |
| 0.9979166666666667 | 0 |
| 0.998611111111111 | 0 |
| 0.9993055555555556 | 0 |